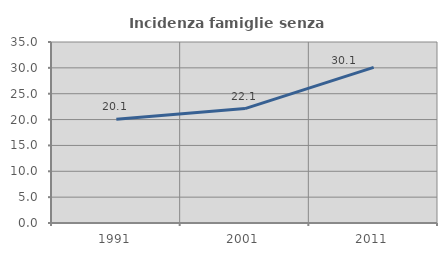
| Category | Incidenza famiglie senza nuclei |
|---|---|
| 1991.0 | 20.076 |
| 2001.0 | 22.127 |
| 2011.0 | 30.086 |